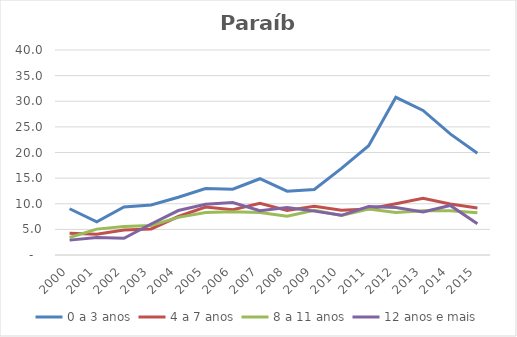
| Category | 0 a 3 anos | 4 a 7 anos | 8 a 11 anos | 12 anos e mais |
|---|---|---|---|---|
| 2000.0 | 9.029 | 4.253 | 3.421 | 2.903 |
| 2001.0 | 6.477 | 4.073 | 5.051 | 3.43 |
| 2002.0 | 9.374 | 4.859 | 5.556 | 3.272 |
| 2003.0 | 9.772 | 5.08 | 5.75 | 6.045 |
| 2004.0 | 11.279 | 7.509 | 7.347 | 8.675 |
| 2005.0 | 12.983 | 9.363 | 8.308 | 9.909 |
| 2006.0 | 12.84 | 8.848 | 8.453 | 10.227 |
| 2007.0 | 14.883 | 10.109 | 8.302 | 8.657 |
| 2008.0 | 12.445 | 8.685 | 7.572 | 9.274 |
| 2009.0 | 12.77 | 9.487 | 8.706 | 8.56 |
| 2010.0 | 16.897 | 8.741 | 7.724 | 7.741 |
| 2011.0 | 21.333 | 8.968 | 8.98 | 9.448 |
| 2012.0 | 30.772 | 9.997 | 8.282 | 9.28 |
| 2013.0 | 28.214 | 11.086 | 8.612 | 8.39 |
| 2014.0 | 23.634 | 9.97 | 8.635 | 9.672 |
| 2015.0 | 19.851 | 9.19 | 8.242 | 6.096 |